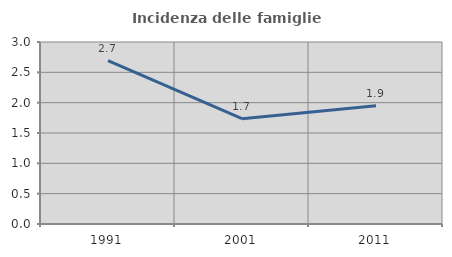
| Category | Incidenza delle famiglie numerose |
|---|---|
| 1991.0 | 2.692 |
| 2001.0 | 1.736 |
| 2011.0 | 1.948 |